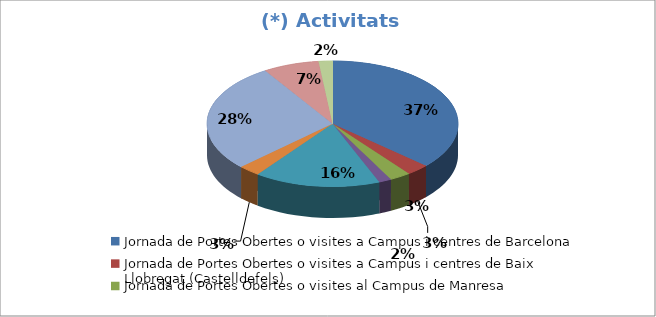
| Category | Series 0 |
|---|---|
| Jornada de Portes Obertes o visites a Campus i centres de Barcelona | 0.366 |
| Jornada de Portes Obertes o visites a Campus i centres de Baix Llobregat (Castelldefels) | 0.03 |
| Jornada de Portes Obertes o visites al Campus de Manresa | 0.027 |
| Jornada de Portes Obertes o visites al Campus de Sant Cugat del Vallès | 0.016 |
| Jornada de Portes Obertes o visites a Campus i centres de Terrassa | 0.162 |
| Jornada de Portes obertes o visites al Campus de Vilanova i la Geltrú | 0.028 |
| Saló de l'Ensenyament o altres fires | 0.281 |
| Sessions informatives de professorat de la UPC al meu centre de secundària | 0.072 |
| Altres | 0.018 |